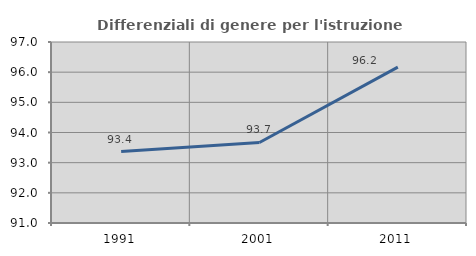
| Category | Differenziali di genere per l'istruzione superiore |
|---|---|
| 1991.0 | 93.37 |
| 2001.0 | 93.67 |
| 2011.0 | 96.167 |